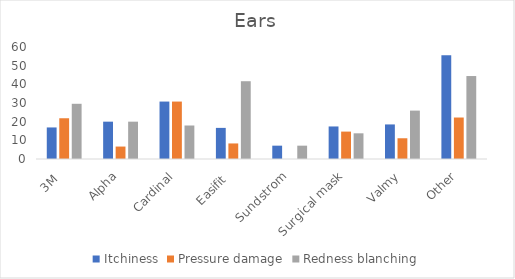
| Category | Itchiness | Pressure damage | Redness blanching |
|---|---|---|---|
| 3M  | 16.901 | 21.831 | 29.577 |
| Alpha | 20 | 6.667 | 20 |
| Cardinal | 30.769 | 30.769 | 17.949 |
| Easifit  | 16.667 | 8.333 | 41.667 |
| Sundstrom | 7.143 | 0 | 7.143 |
| Surgical mask | 17.431 | 14.679 | 13.761 |
| Valmy | 18.519 | 11.111 | 25.926 |
| Other | 55.556 | 22.222 | 44.444 |